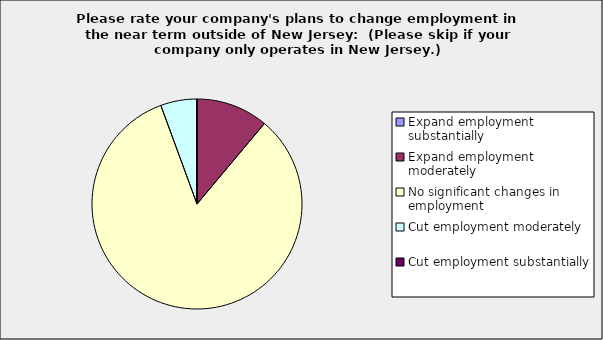
| Category | Series 0 |
|---|---|
| Expand employment substantially | 0 |
| Expand employment moderately | 0.111 |
| No significant changes in employment | 0.833 |
| Cut employment moderately | 0.056 |
| Cut employment substantially | 0 |